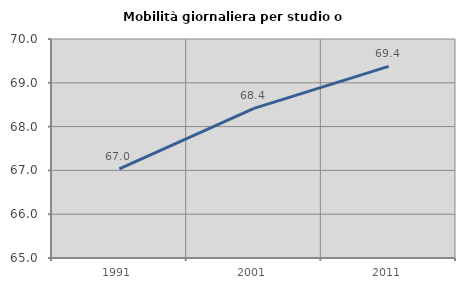
| Category | Mobilità giornaliera per studio o lavoro |
|---|---|
| 1991.0 | 67.037 |
| 2001.0 | 68.417 |
| 2011.0 | 69.375 |